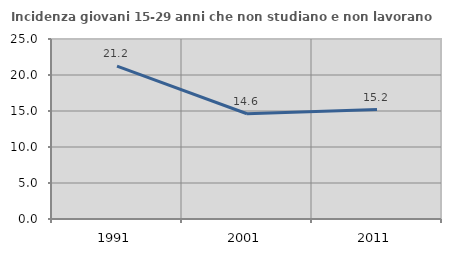
| Category | Incidenza giovani 15-29 anni che non studiano e non lavorano  |
|---|---|
| 1991.0 | 21.242 |
| 2001.0 | 14.62 |
| 2011.0 | 15.2 |